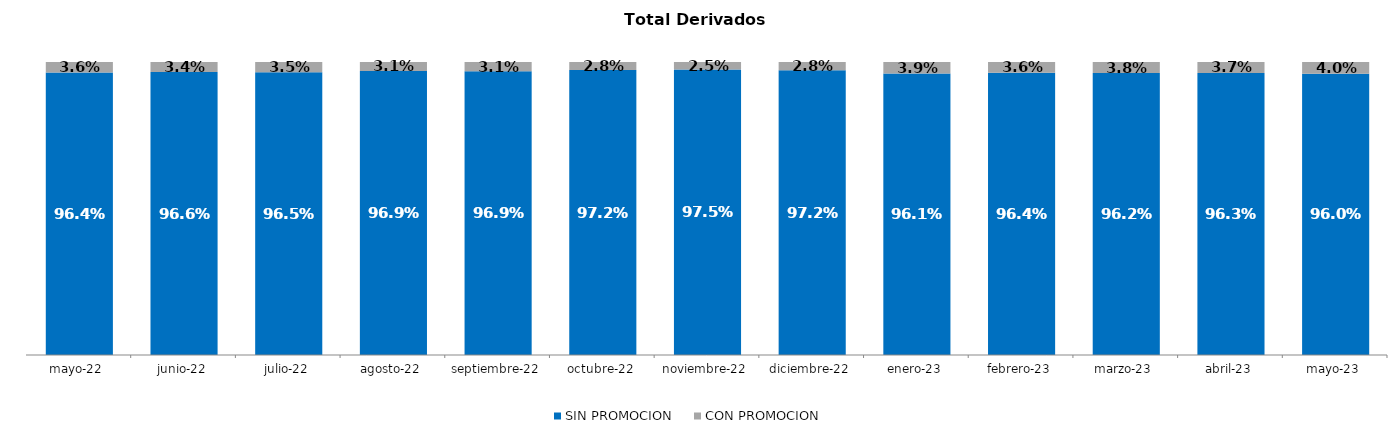
| Category | SIN PROMOCION   | CON PROMOCION   |
|---|---|---|
| 2022-05-01 | 0.964 | 0.036 |
| 2022-06-01 | 0.966 | 0.034 |
| 2022-07-01 | 0.965 | 0.035 |
| 2022-08-01 | 0.969 | 0.031 |
| 2022-09-01 | 0.969 | 0.031 |
| 2022-10-01 | 0.972 | 0.028 |
| 2022-11-01 | 0.975 | 0.025 |
| 2022-12-01 | 0.972 | 0.028 |
| 2023-01-01 | 0.961 | 0.039 |
| 2023-02-01 | 0.964 | 0.036 |
| 2023-03-01 | 0.962 | 0.038 |
| 2023-04-01 | 0.963 | 0.037 |
| 2023-05-01 | 0.96 | 0.04 |